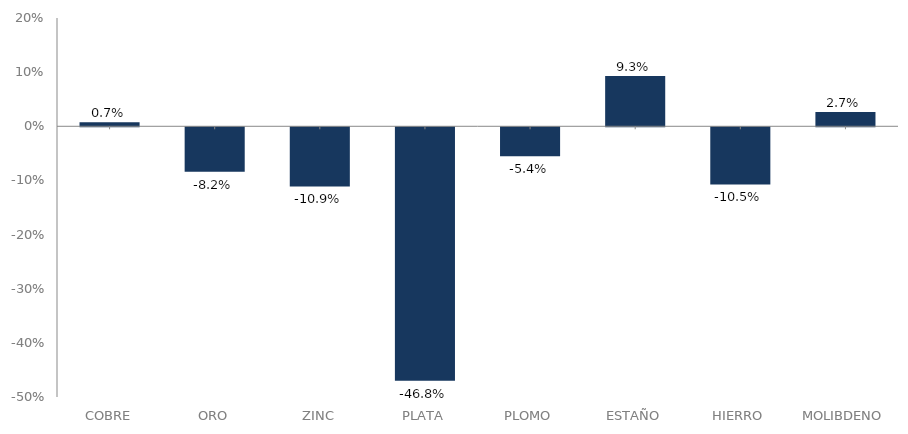
| Category | serie |
|---|---|
| 0 | 0.007 |
| 1 | -0.082 |
| 2 | -0.109 |
| 3 | -0.468 |
| 4 | -0.054 |
| 5 | 0.093 |
| 6 | -0.105 |
| 7 | 0.027 |